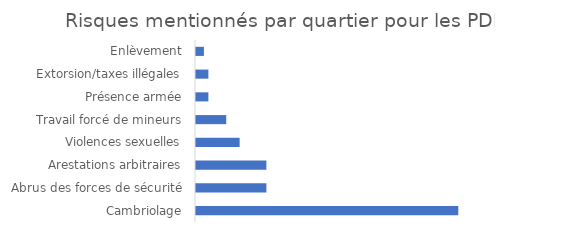
| Category | Frequence | reste |
|---|---|---|
| Cambriolage | 0.738 | 0.262 |
| Abrus des forces de sécurité | 0.2 | 0.8 |
| Arestations arbitraires | 0.2 | 0.8 |
| Violences sexuelles | 0.125 | 0.875 |
| Travail forcé de mineurs | 0.088 | 0.912 |
| Présence armée | 0.038 | 0.962 |
| Extorsion/taxes illégales | 0.038 | 0.962 |
| Enlèvement | 0.025 | 0.975 |